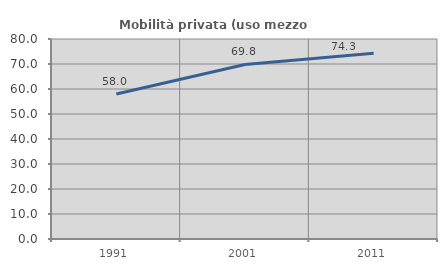
| Category | Mobilità privata (uso mezzo privato) |
|---|---|
| 1991.0 | 57.969 |
| 2001.0 | 69.809 |
| 2011.0 | 74.263 |